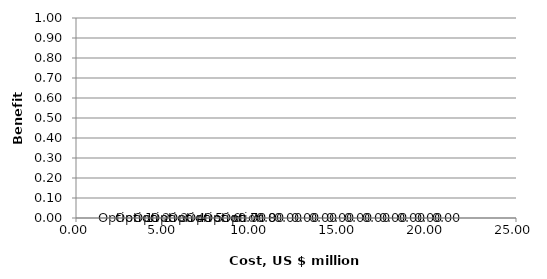
| Category | Benefits |
|---|---|
| 0.0 | 0 |
| 0.0 | 0 |
| 0.0 | 0 |
| 0.0 | 0 |
| 0.0 | 0 |
| 0.0 | 0 |
| 0.0 | 0 |
| 0.0 | 0 |
| 0.0 | 0 |
| 0.0 | 0 |
| 0.0 | 0 |
| 0.0 | 0 |
| 0.0 | 0 |
| 0.0 | 0 |
| 0.0 | 0 |
| 0.0 | 0 |
| 0.0 | 0 |
| 0.0 | 0 |
| 0.0 | 0 |
| 0.0 | 0 |